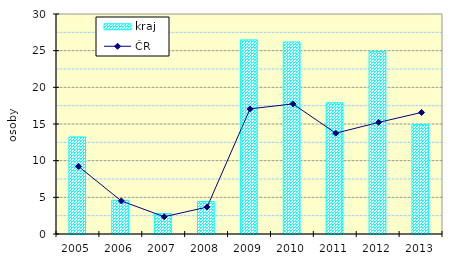
| Category | kraj |
|---|---|
| 2005.0 | 13.237 |
| 2006.0 | 4.599 |
| 2007.0 | 2.771 |
| 2008.0 | 4.429 |
| 2009.0 | 26.466 |
| 2010.0 | 26.182 |
| 2011.0 | 17.89 |
| 2012.0 | 24.875 |
| 2013.0 | 14.952 |